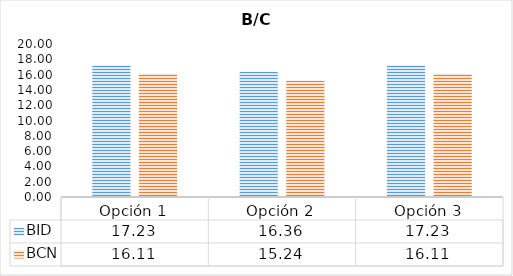
| Category | BID | BCN |
|---|---|---|
| Opción 1 | 17.234 | 16.11 |
| Opción 2 | 16.362 | 15.239 |
| Opción 3 | 17.234 | 16.11 |